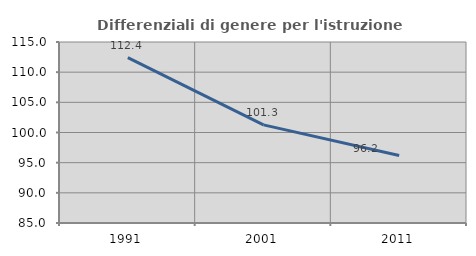
| Category | Differenziali di genere per l'istruzione superiore |
|---|---|
| 1991.0 | 112.399 |
| 2001.0 | 101.27 |
| 2011.0 | 96.177 |